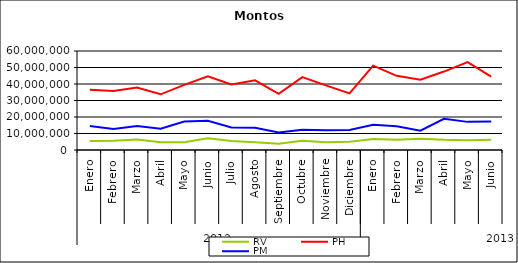
| Category | RV | PH | PM |
|---|---|---|---|
| 0 | 5488714.126 | 36545855.086 | 14497589.738 |
| 1 | 5561280.58 | 35823440.08 | 12698333.328 |
| 2 | 6398986.979 | 37854831.303 | 14475738.644 |
| 3 | 4681922.842 | 33750742.386 | 12858975.967 |
| 4 | 4682928.209 | 39491753.151 | 17313339.446 |
| 5 | 7096266.187 | 44637287.582 | 17754192.968 |
| 6 | 5451623.882 | 39757983.873 | 13624526.171 |
| 7 | 4684453.851 | 42224570.378 | 13520398.629 |
| 8 | 3854535.018 | 34047933.18 | 10553221.238 |
| 9 | 5602263.508 | 44148107.248 | 12207679.138 |
| 10 | 4675526.921 | 39150631.457 | 11989364.221 |
| 11 | 5068639.314 | 34283372.071 | 12134709.335 |
| 12 | 6603412.357 | 51097257.501 | 15291994.497 |
| 13 | 6144371.716 | 44938482.89 | 14418861.164 |
| 14 | 6870539.137 | 42574717.992 | 11735480.075 |
| 15 | 6139858.354 | 47535968.024 | 18924825.739 |
| 16 | 5890476.617 | 53273527.932 | 17047621.863 |
| 17 | 6142686.449 | 44450017.2 | 17254269.094 |